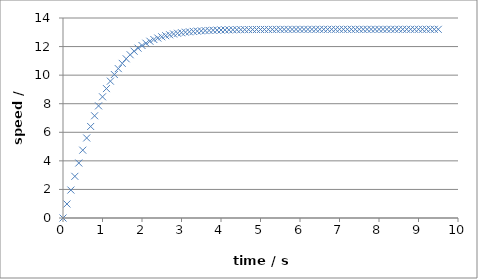
| Category | speed / m/s |
|---|---|
| 0.0 | 0 |
| 0.1 | 0.981 |
| 0.2 | 1.957 |
| 0.3 | 2.916 |
| 0.4 | 3.849 |
| 0.5 | 4.747 |
| 0.6 | 5.601 |
| 0.7 | 6.406 |
| 0.8 | 7.156 |
| 0.9 | 7.849 |
| 1.0 | 8.483 |
| 1.1 | 9.059 |
| 1.2 | 9.579 |
| 1.3 | 10.044 |
| 1.4 | 10.457 |
| 1.5 | 10.823 |
| 1.6 | 11.145 |
| 1.7 | 11.428 |
| 1.8 | 11.674 |
| 1.900000000000001 | 11.888 |
| 2.0 | 12.074 |
| 2.100000000000001 | 12.235 |
| 2.200000000000001 | 12.374 |
| 2.300000000000001 | 12.494 |
| 2.400000000000001 | 12.597 |
| 2.500000000000001 | 12.685 |
| 2.600000000000001 | 12.761 |
| 2.700000000000001 | 12.826 |
| 2.800000000000001 | 12.882 |
| 2.900000000000001 | 12.929 |
| 3.000000000000001 | 12.97 |
| 3.100000000000001 | 13.005 |
| 3.200000000000001 | 13.034 |
| 3.300000000000002 | 13.06 |
| 3.400000000000002 | 13.081 |
| 3.500000000000002 | 13.1 |
| 3.600000000000002 | 13.116 |
| 3.700000000000002 | 13.129 |
| 3.800000000000002 | 13.14 |
| 3.900000000000002 | 13.15 |
| 4.000000000000002 | 13.158 |
| 4.100000000000001 | 13.165 |
| 4.200000000000001 | 13.171 |
| 4.300000000000001 | 13.177 |
| 4.4 | 13.181 |
| 4.5 | 13.185 |
| 4.6 | 13.188 |
| 4.699999999999999 | 13.191 |
| 4.799999999999999 | 13.193 |
| 4.899999999999999 | 13.195 |
| 4.999999999999998 | 13.197 |
| 5.099999999999998 | 13.198 |
| 5.199999999999997 | 13.199 |
| 5.299999999999997 | 13.2 |
| 5.399999999999997 | 13.201 |
| 5.499999999999996 | 13.202 |
| 5.599999999999996 | 13.202 |
| 5.699999999999996 | 13.203 |
| 5.799999999999995 | 13.203 |
| 5.899999999999995 | 13.204 |
| 5.999999999999994 | 13.204 |
| 6.099999999999994 | 13.204 |
| 6.199999999999994 | 13.205 |
| 6.299999999999994 | 13.205 |
| 6.399999999999993 | 13.205 |
| 6.499999999999993 | 13.205 |
| 6.599999999999993 | 13.205 |
| 6.699999999999992 | 13.205 |
| 6.799999999999992 | 13.206 |
| 6.899999999999991 | 13.206 |
| 6.999999999999991 | 13.206 |
| 7.099999999999991 | 13.206 |
| 7.19999999999999 | 13.206 |
| 7.29999999999999 | 13.206 |
| 7.39999999999999 | 13.206 |
| 7.49999999999999 | 13.206 |
| 7.599999999999989 | 13.206 |
| 7.699999999999989 | 13.206 |
| 7.799999999999988 | 13.206 |
| 7.899999999999988 | 13.206 |
| 7.999999999999987 | 13.206 |
| 8.099999999999987 | 13.206 |
| 8.199999999999987 | 13.206 |
| 8.299999999999986 | 13.206 |
| 8.399999999999986 | 13.206 |
| 8.499999999999986 | 13.206 |
| 8.599999999999985 | 13.206 |
| 8.699999999999983 | 13.206 |
| 8.799999999999985 | 13.206 |
| 8.899999999999984 | 13.206 |
| 8.999999999999982 | 13.206 |
| 9.099999999999984 | 13.206 |
| 9.199999999999983 | 13.206 |
| 9.299999999999981 | 13.206 |
| 9.39999999999998 | 13.206 |
| 9.49999999999998 | 13.206 |